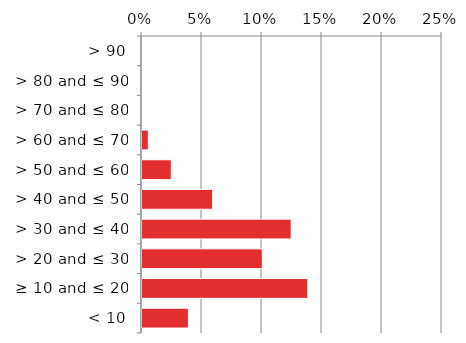
| Category | Non native |
|---|---|
|  < 10 | 0.04 |
|  ≥ 10 and ≤ 20 | 0.139 |
|  > 20 and ≤ 30 | 0.101 |
|  > 30 and ≤ 40 | 0.125 |
|  > 40 and ≤ 50 | 0.06 |
|  > 50 and ≤ 60 | 0.025 |
|  > 60 and ≤ 70 | 0.006 |
|  > 70 and ≤ 80 | 0 |
|  > 80 and ≤ 90 | 0 |
|  > 90 | 0 |